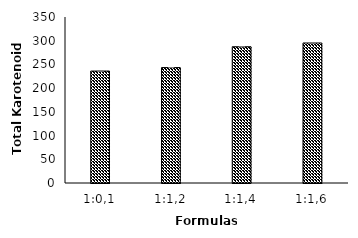
| Category | Total Karotenoid (ppm) |
|---|---|
| 1:0,1 | 236.02 |
| 1:1,2 | 243.41 |
| 1:1,4 | 287.34 |
| 1:1,6 | 295.24 |